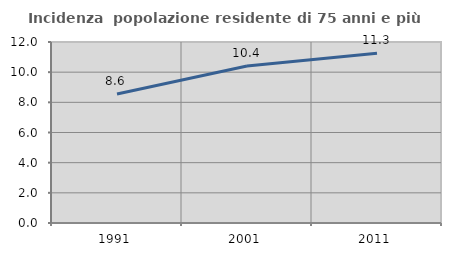
| Category | Incidenza  popolazione residente di 75 anni e più |
|---|---|
| 1991.0 | 8.551 |
| 2001.0 | 10.408 |
| 2011.0 | 11.259 |